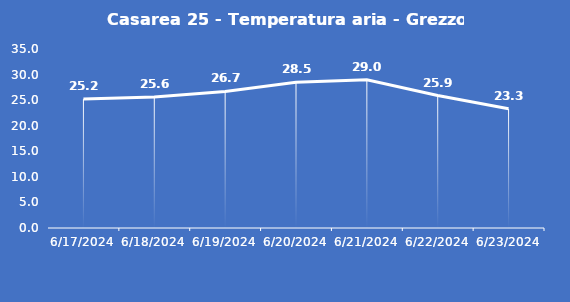
| Category | Casarea 25 - Temperatura aria - Grezzo (°C) |
|---|---|
| 6/17/24 | 25.2 |
| 6/18/24 | 25.6 |
| 6/19/24 | 26.7 |
| 6/20/24 | 28.5 |
| 6/21/24 | 29 |
| 6/22/24 | 25.9 |
| 6/23/24 | 23.3 |